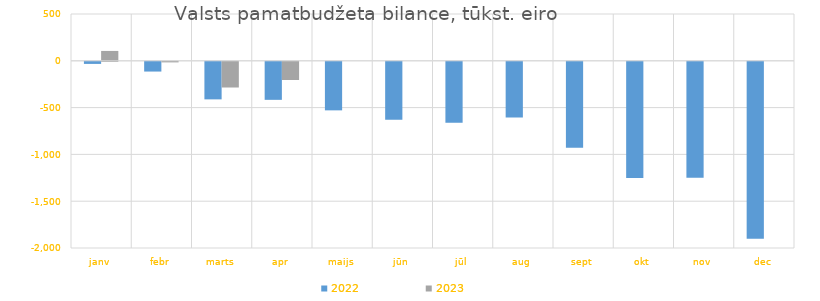
| Category | 2022 | 2023 |
|---|---|---|
| janv | -22576.613 | 105353.718 |
| febr | -104207.657 | -6220.179 |
| marts | -401343.883 | -274666.553 |
| apr | -406432.786 | -194503.718 |
| maijs | -518798.917 | 0 |
| jūn | -620133.729 | 0 |
| jūl | -652119.984 | 0 |
| aug | -596051.014 | 0 |
| sept | -919146.823 | 0 |
| okt | -1242437.213 | 0 |
| nov | -1239928.794 | 0 |
| dec | -1889248.09 | 0 |